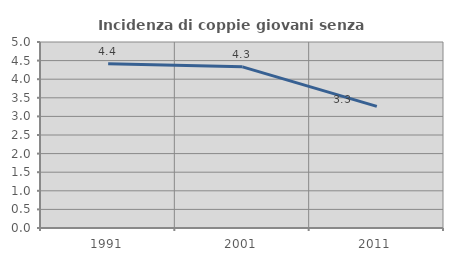
| Category | Incidenza di coppie giovani senza figli |
|---|---|
| 1991.0 | 4.414 |
| 2001.0 | 4.332 |
| 2011.0 | 3.268 |